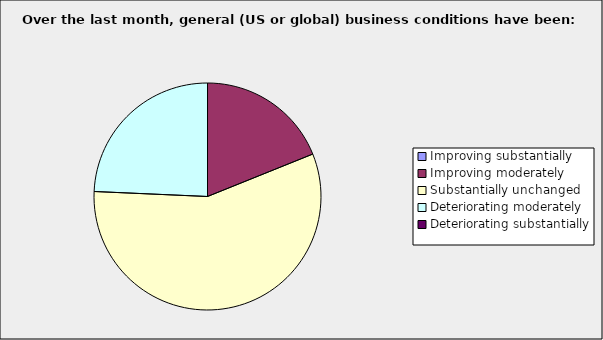
| Category | Series 0 |
|---|---|
| Improving substantially | 0 |
| Improving moderately | 0.189 |
| Substantially unchanged | 0.568 |
| Deteriorating moderately | 0.243 |
| Deteriorating substantially | 0 |